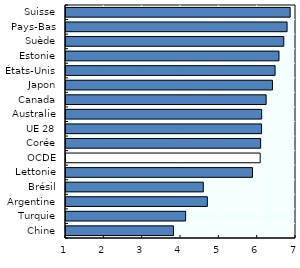
| Category | 2017-2018 |
|---|---|
| Chine | 3.803 |
| Turquie | 4.12 |
| Argentine | 4.688 |
| Brésil | 4.582 |
| Lettonie | 5.866 |
| OCDE | 6.066 |
| Corée | 6.077 |
| UE 28 | 6.102 |
| Australie | 6.104 |
| Canada | 6.221 |
| Japon | 6.385 |
| États-Unis | 6.454 |
| Estonie | 6.556 |
| Suède | 6.681 |
| Pays-Bas | 6.767 |
| Suisse | 6.848 |